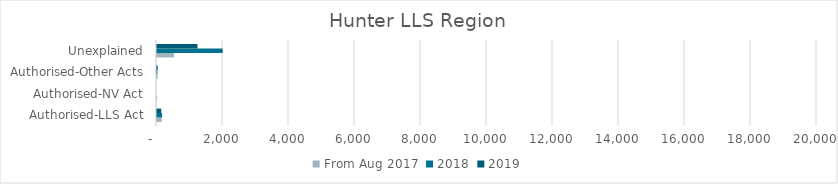
| Category | From Aug 2017 | 2018 | 2019 |
|---|---|---|---|
| Authorised-LLS Act | 144 | 155 | 128 |
| Authorised-NV Act | 3 | 0 | 0 |
| Authorised-Other Acts | 21 | 11 | 22 |
| Unexplained | 515 | 1991 | 1227 |